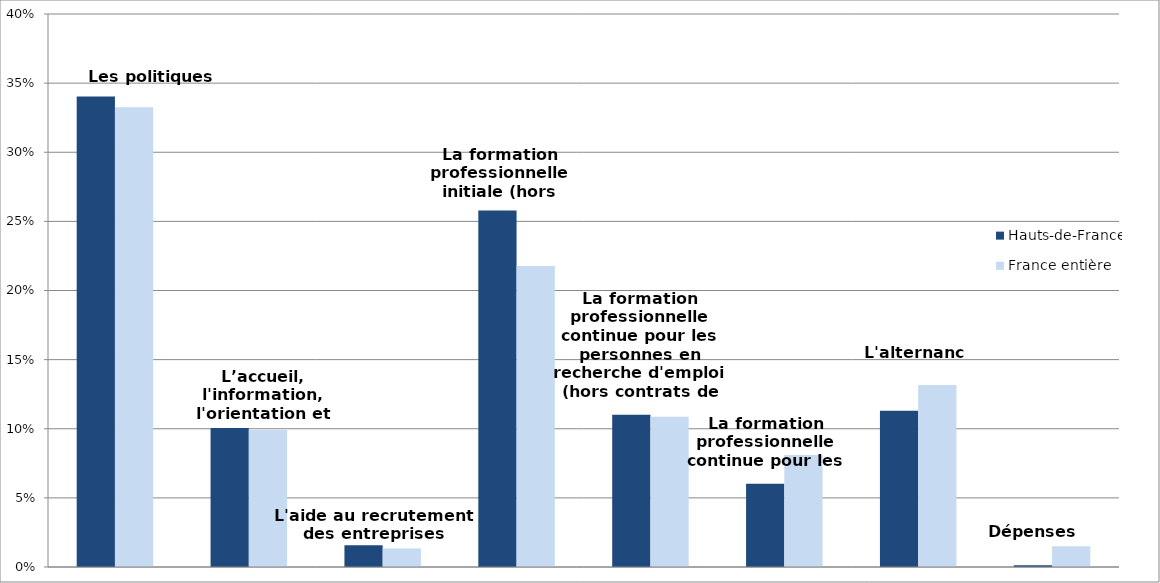
| Category | Hauts-de-France | France entière |
|---|---|---|
| Les politiques d'emploi | 0.34 | 0.333 |
| L’accueil, l'information, l'orientation et l'accompagnement | 0.101 | 0.099 |
| L'aide au recrutement des entreprises | 0.016 | 0.013 |
| La formation professionnelle initiale (hors apprentissage) | 0.258 | 0.218 |
| La formation professionnelle continue pour les personnes en recherche d'emploi (hors contrats de professionnalisation) | 0.11 | 0.109 |
| La formation professionnelle continue pour les actifs occupés | 0.06 | 0.081 |
| L'alternance | 0.113 | 0.132 |
| Dépenses non-ventilables | 0.001 | 0.015 |